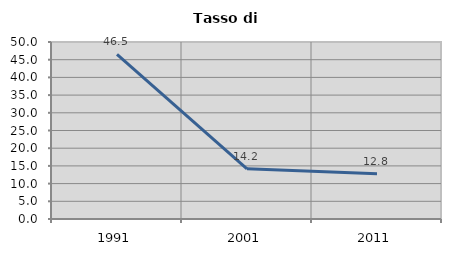
| Category | Tasso di disoccupazione   |
|---|---|
| 1991.0 | 46.479 |
| 2001.0 | 14.182 |
| 2011.0 | 12.766 |